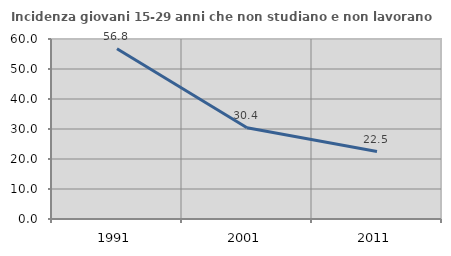
| Category | Incidenza giovani 15-29 anni che non studiano e non lavorano  |
|---|---|
| 1991.0 | 56.752 |
| 2001.0 | 30.417 |
| 2011.0 | 22.5 |